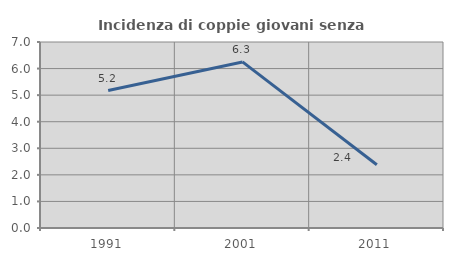
| Category | Incidenza di coppie giovani senza figli |
|---|---|
| 1991.0 | 5.172 |
| 2001.0 | 6.25 |
| 2011.0 | 2.381 |